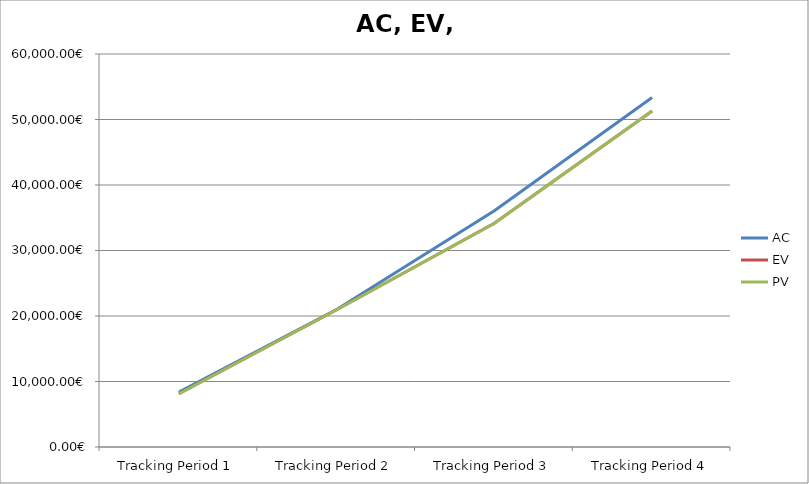
| Category | AC | EV | PV |
|---|---|---|---|
| Tracking Period 1 | 8368.53 | 8127.53 | 8127.53 |
| Tracking Period 2 | 20998.27 | 20961.27 | 20961.27 |
| Tracking Period 3 | 36062.71 | 34160.71 | 34160.71 |
| Tracking Period 4 | 53351.38 | 51303.38 | 51303.38 |